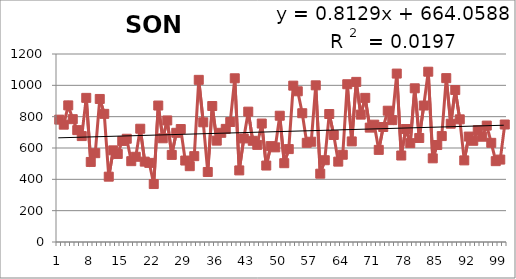
| Category | 1913-2012 |
|---|---|
| 0 | 781 |
| 1 | 749 |
| 2 | 872 |
| 3 | 784 |
| 4 | 714 |
| 5 | 676 |
| 6 | 920 |
| 7 | 511 |
| 8 | 567 |
| 9 | 913 |
| 10 | 818 |
| 11 | 417 |
| 12 | 585 |
| 13 | 562 |
| 14 | 645 |
| 15 | 659 |
| 16 | 516 |
| 17 | 544 |
| 18 | 723 |
| 19 | 513 |
| 20 | 505 |
| 21 | 370 |
| 22 | 871 |
| 23 | 662 |
| 24 | 776 |
| 25 | 556 |
| 26 | 697 |
| 27 | 721 |
| 28 | 520 |
| 29 | 484 |
| 30 | 548 |
| 31 | 1035 |
| 32 | 764 |
| 33 | 447 |
| 34 | 868 |
| 35 | 647 |
| 36 | 697 |
| 37 | 722 |
| 38 | 766 |
| 39 | 1045 |
| 40 | 457 |
| 41 | 661 |
| 42 | 832 |
| 43 | 646 |
| 44 | 620 |
| 45 | 756 |
| 46 | 488 |
| 47 | 612 |
| 48 | 604 |
| 49 | 806 |
| 50 | 503 |
| 51 | 593 |
| 52 | 998 |
| 53 | 962 |
| 54 | 822 |
| 55 | 633 |
| 56 | 640 |
| 57 | 1000 |
| 58 | 436 |
| 59 | 522 |
| 60 | 817 |
| 61 | 683 |
| 62 | 513 |
| 63 | 557 |
| 64 | 1007 |
| 65 | 642 |
| 66 | 1022 |
| 67 | 813 |
| 68 | 920 |
| 69 | 730 |
| 70 | 749 |
| 71 | 588 |
| 72 | 734 |
| 73 | 838 |
| 74 | 778 |
| 75 | 1075 |
| 76 | 552 |
| 77 | 721 |
| 78 | 631 |
| 79 | 981 |
| 80 | 664 |
| 81 | 871 |
| 82 | 1087 |
| 83 | 534 |
| 84 | 619 |
| 85 | 676 |
| 86 | 1046 |
| 87 | 755 |
| 88 | 970 |
| 89 | 783 |
| 90 | 521 |
| 91 | 673 |
| 92 | 646 |
| 93 | 714 |
| 94 | 672 |
| 95 | 743 |
| 96 | 633 |
| 97 | 516 |
| 98 | 526 |
| 99 | 750 |